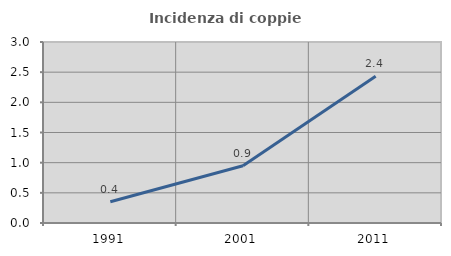
| Category | Incidenza di coppie miste |
|---|---|
| 1991.0 | 0.352 |
| 2001.0 | 0.949 |
| 2011.0 | 2.434 |